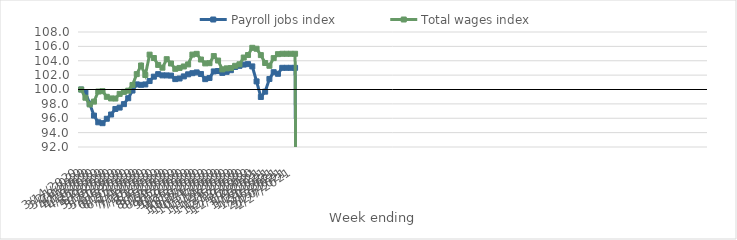
| Category | Payroll jobs index | Total wages index |
|---|---|---|
| 14/03/2020 | 100 | 100 |
| 21/03/2020 | 99.572 | 98.857 |
| 28/03/2020 | 98.031 | 97.919 |
| 04/04/2020 | 96.372 | 98.313 |
| 11/04/2020 | 95.435 | 99.713 |
| 18/04/2020 | 95.314 | 99.765 |
| 25/04/2020 | 95.93 | 98.981 |
| 02/05/2020 | 96.52 | 98.757 |
| 09/05/2020 | 97.291 | 98.742 |
| 16/05/2020 | 97.483 | 99.39 |
| 23/05/2020 | 97.966 | 99.668 |
| 30/05/2020 | 98.783 | 99.836 |
| 06/06/2020 | 99.855 | 100.632 |
| 13/06/2020 | 100.711 | 102.14 |
| 20/06/2020 | 100.649 | 103.339 |
| 27/06/2020 | 100.706 | 102.013 |
| 04/07/2020 | 101.178 | 104.849 |
| 11/07/2020 | 101.786 | 104.383 |
| 18/07/2020 | 102.135 | 103.421 |
| 25/07/2020 | 101.964 | 103.034 |
| 01/08/2020 | 101.96 | 104.219 |
| 08/08/2020 | 101.933 | 103.617 |
| 15/08/2020 | 101.447 | 102.874 |
| 22/08/2020 | 101.531 | 103.001 |
| 29/08/2020 | 101.823 | 103.205 |
| 05/09/2020 | 102.113 | 103.49 |
| 12/09/2020 | 102.271 | 104.857 |
| 19/09/2020 | 102.377 | 104.961 |
| 26/09/2020 | 102.16 | 104.17 |
| 03/10/2020 | 101.44 | 103.631 |
| 10/10/2020 | 101.605 | 103.664 |
| 17/10/2020 | 102.514 | 104.651 |
| 24/10/2020 | 102.573 | 104.027 |
| 31/10/2020 | 102.31 | 102.796 |
| 07/11/2020 | 102.457 | 102.94 |
| 14/11/2020 | 102.686 | 102.985 |
| 21/11/2020 | 103.129 | 103.299 |
| 28/11/2020 | 103.29 | 103.51 |
| 05/12/2020 | 103.466 | 104.447 |
| 12/12/2020 | 103.53 | 104.795 |
| 19/12/2020 | 103.213 | 105.802 |
| 26/12/2020 | 101.128 | 105.669 |
| 02/01/2021 | 98.96 | 104.786 |
| 09/01/2021 | 99.696 | 103.689 |
| 16/01/2021 | 101.467 | 103.301 |
| 23/01/2021 | 102.408 | 104.367 |
| 30/01/2021 | 102.184 | 104.917 |
| 06/02/2021 | 103.016 | 104.971 |
| 13/02/2021 | 103.016 | 104.971 |
| 20/02/2021 | 103.016 | 104.971 |
| 27/02/2021 | 103.016 | 104.971 |